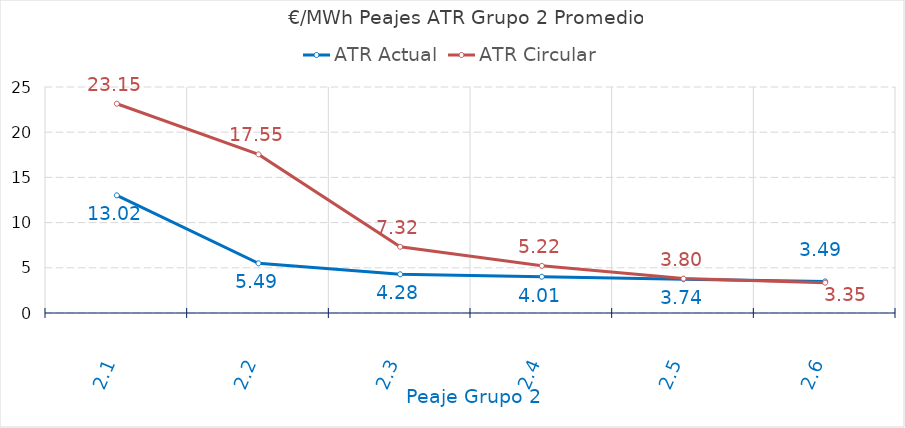
| Category | ATR Actual | ATR Circular |
|---|---|---|
| 2.1 | 13.016 | 23.15 |
| 2.2 | 5.494 | 17.546 |
| 2.3 | 4.283 | 7.322 |
| 2.4 | 4.009 | 5.216 |
| 2.5 | 3.743 | 3.803 |
| 2.6 | 3.494 | 3.351 |